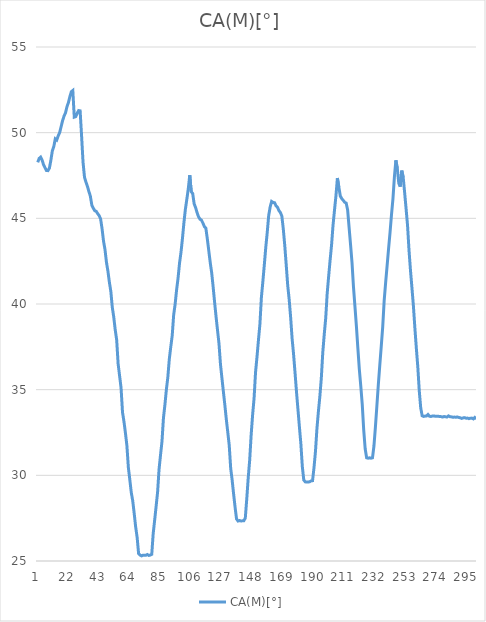
| Category | CA(M)[°] |
|---|---|
| 0 | 48.268 |
| 1 | 48.5 |
| 2 | 48.573 |
| 3 | 48.394 |
| 4 | 48.123 |
| 5 | 47.948 |
| 6 | 47.789 |
| 7 | 47.784 |
| 8 | 47.933 |
| 9 | 48.397 |
| 10 | 48.944 |
| 11 | 49.189 |
| 12 | 49.639 |
| 13 | 49.571 |
| 14 | 49.812 |
| 15 | 50.004 |
| 16 | 50.348 |
| 17 | 50.703 |
| 18 | 50.966 |
| 19 | 51.157 |
| 20 | 51.513 |
| 21 | 51.759 |
| 22 | 52.105 |
| 23 | 52.392 |
| 24 | 52.462 |
| 25 | 50.908 |
| 26 | 50.939 |
| 27 | 51.137 |
| 28 | 51.292 |
| 29 | 51.275 |
| 30 | 49.812 |
| 31 | 48.269 |
| 32 | 47.402 |
| 33 | 47.11 |
| 34 | 46.869 |
| 35 | 46.562 |
| 36 | 46.298 |
| 37 | 45.769 |
| 38 | 45.596 |
| 39 | 45.447 |
| 40 | 45.409 |
| 41 | 45.274 |
| 42 | 45.162 |
| 43 | 44.967 |
| 44 | 44.403 |
| 45 | 43.675 |
| 46 | 43.188 |
| 47 | 42.448 |
| 48 | 41.926 |
| 49 | 41.278 |
| 50 | 40.742 |
| 51 | 39.812 |
| 52 | 39.243 |
| 53 | 38.498 |
| 54 | 37.91 |
| 55 | 36.501 |
| 56 | 35.811 |
| 57 | 35.107 |
| 58 | 33.677 |
| 59 | 33.134 |
| 60 | 32.468 |
| 61 | 31.729 |
| 62 | 30.458 |
| 63 | 29.735 |
| 64 | 28.993 |
| 65 | 28.506 |
| 66 | 27.769 |
| 67 | 26.985 |
| 68 | 26.382 |
| 69 | 25.436 |
| 70 | 25.347 |
| 71 | 25.299 |
| 72 | 25.336 |
| 73 | 25.34 |
| 74 | 25.333 |
| 75 | 25.377 |
| 76 | 25.324 |
| 77 | 25.345 |
| 78 | 25.39 |
| 79 | 26.614 |
| 80 | 27.39 |
| 81 | 28.199 |
| 82 | 29.021 |
| 83 | 30.355 |
| 84 | 31.187 |
| 85 | 31.978 |
| 86 | 33.345 |
| 87 | 34.112 |
| 88 | 35.001 |
| 89 | 35.719 |
| 90 | 36.777 |
| 91 | 37.492 |
| 92 | 38.157 |
| 93 | 39.367 |
| 94 | 39.995 |
| 95 | 40.829 |
| 96 | 41.513 |
| 97 | 42.378 |
| 98 | 43.012 |
| 99 | 43.82 |
| 100 | 44.737 |
| 101 | 45.528 |
| 102 | 46.115 |
| 103 | 46.731 |
| 104 | 47.517 |
| 105 | 46.56 |
| 106 | 46.448 |
| 107 | 45.849 |
| 108 | 45.626 |
| 109 | 45.334 |
| 110 | 45.09 |
| 111 | 44.951 |
| 112 | 44.896 |
| 113 | 44.724 |
| 114 | 44.521 |
| 115 | 44.437 |
| 116 | 43.81 |
| 117 | 43.12 |
| 118 | 42.426 |
| 119 | 41.825 |
| 120 | 40.998 |
| 121 | 40.098 |
| 122 | 39.255 |
| 123 | 38.462 |
| 124 | 37.689 |
| 125 | 36.494 |
| 126 | 35.684 |
| 127 | 34.891 |
| 128 | 34.11 |
| 129 | 33.276 |
| 130 | 32.519 |
| 131 | 31.755 |
| 132 | 30.41 |
| 133 | 29.719 |
| 134 | 28.909 |
| 135 | 28.147 |
| 136 | 27.455 |
| 137 | 27.334 |
| 138 | 27.362 |
| 139 | 27.339 |
| 140 | 27.343 |
| 141 | 27.346 |
| 142 | 27.513 |
| 143 | 28.63 |
| 144 | 29.859 |
| 145 | 30.888 |
| 146 | 32.358 |
| 147 | 33.527 |
| 148 | 34.499 |
| 149 | 36.013 |
| 150 | 36.916 |
| 151 | 37.899 |
| 152 | 38.831 |
| 153 | 40.379 |
| 154 | 41.299 |
| 155 | 42.276 |
| 156 | 43.306 |
| 157 | 44.176 |
| 158 | 45.162 |
| 159 | 45.665 |
| 160 | 45.985 |
| 161 | 45.927 |
| 162 | 45.912 |
| 163 | 45.733 |
| 164 | 45.652 |
| 165 | 45.451 |
| 166 | 45.341 |
| 167 | 45.128 |
| 168 | 44.37 |
| 169 | 43.403 |
| 170 | 42.27 |
| 171 | 41.093 |
| 172 | 40.275 |
| 173 | 39.237 |
| 174 | 37.999 |
| 175 | 37.088 |
| 176 | 36.013 |
| 177 | 34.888 |
| 178 | 33.868 |
| 179 | 32.842 |
| 180 | 31.849 |
| 181 | 30.516 |
| 182 | 29.727 |
| 183 | 29.618 |
| 184 | 29.611 |
| 185 | 29.605 |
| 186 | 29.627 |
| 187 | 29.672 |
| 188 | 29.687 |
| 189 | 30.452 |
| 190 | 31.396 |
| 191 | 32.724 |
| 192 | 33.721 |
| 193 | 34.605 |
| 194 | 35.676 |
| 195 | 37.17 |
| 196 | 38.225 |
| 197 | 39.162 |
| 198 | 40.601 |
| 199 | 41.597 |
| 200 | 42.55 |
| 201 | 43.435 |
| 202 | 44.583 |
| 203 | 45.465 |
| 204 | 46.303 |
| 205 | 47.35 |
| 206 | 46.813 |
| 207 | 46.297 |
| 208 | 46.153 |
| 209 | 46.045 |
| 210 | 45.936 |
| 211 | 45.898 |
| 212 | 45.494 |
| 213 | 44.469 |
| 214 | 43.466 |
| 215 | 42.409 |
| 216 | 41.001 |
| 217 | 39.864 |
| 218 | 38.711 |
| 219 | 37.43 |
| 220 | 36.19 |
| 221 | 35.204 |
| 222 | 34.144 |
| 223 | 32.651 |
| 224 | 31.547 |
| 225 | 31.023 |
| 226 | 31 |
| 227 | 31.026 |
| 228 | 31 |
| 229 | 31.022 |
| 230 | 31.712 |
| 231 | 32.814 |
| 232 | 34.048 |
| 233 | 35.291 |
| 234 | 36.428 |
| 235 | 37.527 |
| 236 | 38.662 |
| 237 | 40.199 |
| 238 | 41.242 |
| 239 | 42.224 |
| 240 | 43.223 |
| 241 | 44.167 |
| 242 | 45.205 |
| 243 | 46.141 |
| 244 | 47.42 |
| 245 | 48.385 |
| 246 | 47.893 |
| 247 | 47.049 |
| 248 | 46.85 |
| 249 | 47.783 |
| 250 | 47.402 |
| 251 | 46.5 |
| 252 | 45.553 |
| 253 | 44.572 |
| 254 | 43.121 |
| 255 | 41.956 |
| 256 | 40.94 |
| 257 | 39.884 |
| 258 | 38.605 |
| 259 | 37.424 |
| 260 | 36.337 |
| 261 | 34.936 |
| 262 | 33.936 |
| 263 | 33.473 |
| 264 | 33.438 |
| 265 | 33.457 |
| 266 | 33.465 |
| 267 | 33.548 |
| 268 | 33.447 |
| 269 | 33.437 |
| 270 | 33.46 |
| 271 | 33.469 |
| 272 | 33.444 |
| 273 | 33.443 |
| 274 | 33.448 |
| 275 | 33.434 |
| 276 | 33.426 |
| 277 | 33.403 |
| 278 | 33.434 |
| 279 | 33.414 |
| 280 | 33.407 |
| 281 | 33.469 |
| 282 | 33.421 |
| 283 | 33.411 |
| 284 | 33.392 |
| 285 | 33.4 |
| 286 | 33.39 |
| 287 | 33.406 |
| 288 | 33.377 |
| 289 | 33.36 |
| 290 | 33.323 |
| 291 | 33.353 |
| 292 | 33.367 |
| 293 | 33.338 |
| 294 | 33.339 |
| 295 | 33.308 |
| 296 | 33.337 |
| 297 | 33.339 |
| 298 | 33.295 |
| 299 | 33.378 |
| 300 | 33.291 |